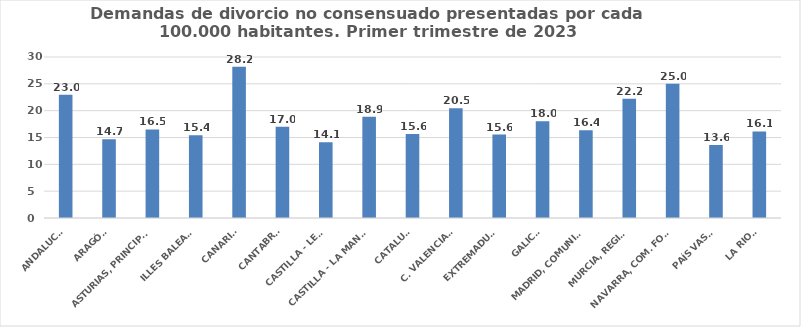
| Category | Series 0 |
|---|---|
| ANDALUCÍA | 22.973 |
| ARAGÓN | 14.674 |
| ASTURIAS, PRINCIPADO | 16.491 |
| ILLES BALEARS | 15.414 |
| CANARIAS | 28.198 |
| CANTABRIA | 16.992 |
| CASTILLA - LEÓN | 14.102 |
| CASTILLA - LA MANCHA | 18.889 |
| CATALUÑA | 15.635 |
| C. VALENCIANA | 20.467 |
| EXTREMADURA | 15.555 |
| GALICIA | 18.039 |
| MADRID, COMUNIDAD | 16.367 |
| MURCIA, REGIÓN | 22.22 |
| NAVARRA, COM. FORAL | 24.993 |
| PAÍS VASCO | 13.604 |
| LA RIOJA | 16.136 |